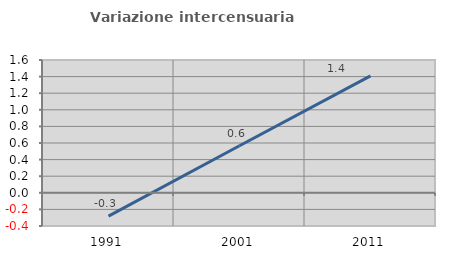
| Category | Variazione intercensuaria annua |
|---|---|
| 1991.0 | -0.28 |
| 2001.0 | 0.567 |
| 2011.0 | 1.409 |